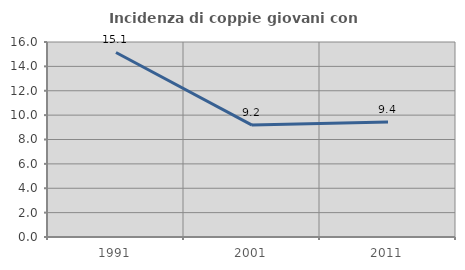
| Category | Incidenza di coppie giovani con figli |
|---|---|
| 1991.0 | 15.139 |
| 2001.0 | 9.18 |
| 2011.0 | 9.431 |